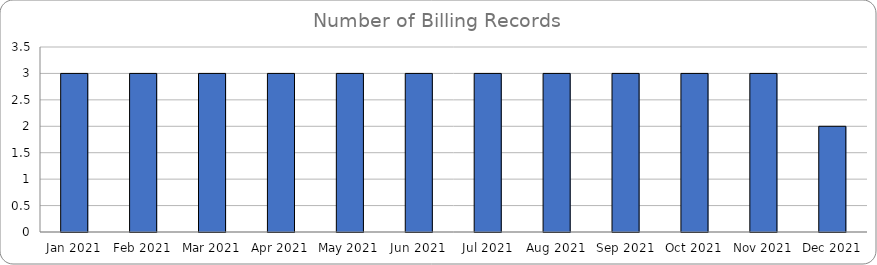
| Category | Num Records |
|---|---|
| Jan 2021 | 3 |
| Feb 2021 | 3 |
| Mar 2021 | 3 |
| Apr 2021 | 3 |
| May 2021 | 3 |
| Jun 2021 | 3 |
| Jul 2021 | 3 |
| Aug 2021 | 3 |
| Sep 2021 | 3 |
| Oct 2021 | 3 |
| Nov 2021 | 3 |
| Dec 2021 | 2 |